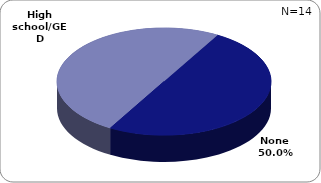
| Category | Series 0 |
|---|---|
| None | 0.5 |
| High school/GED | 0.5 |